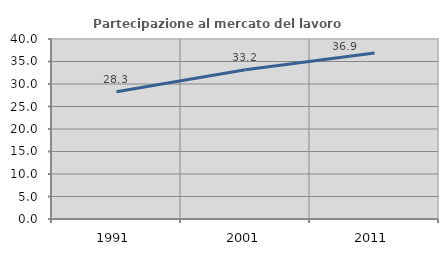
| Category | Partecipazione al mercato del lavoro  femminile |
|---|---|
| 1991.0 | 28.257 |
| 2001.0 | 33.156 |
| 2011.0 | 36.879 |